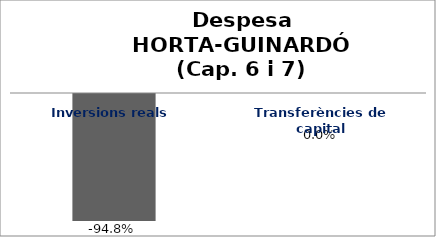
| Category | Series 0 |
|---|---|
| Inversions reals | -0.948 |
| Transferències de capital | 0 |